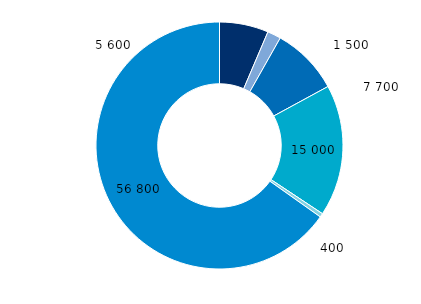
| Category | 2018 |
|---|---|
| Travail | 5590 |
| Famille accompagnante | 1543 |
| Famille | 7744 |
| Humanitaire | 15020 |
| Autre | 440 |
| Libre circulation | 56798 |